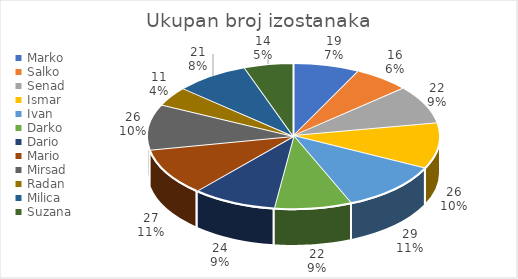
| Category | Ukupan broj izostanaka |
|---|---|
| Marko | 19 |
| Salko | 16 |
| Senad | 22 |
| Ismar | 26 |
| Ivan | 29 |
| Darko | 22 |
| Dario | 24 |
| Mario | 27 |
| Mirsad | 26 |
| Radan | 11 |
| Milica | 21 |
| Suzana | 14 |